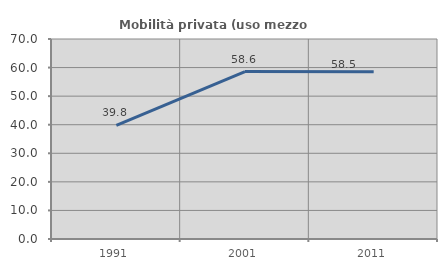
| Category | Mobilità privata (uso mezzo privato) |
|---|---|
| 1991.0 | 39.801 |
| 2001.0 | 58.599 |
| 2011.0 | 58.503 |